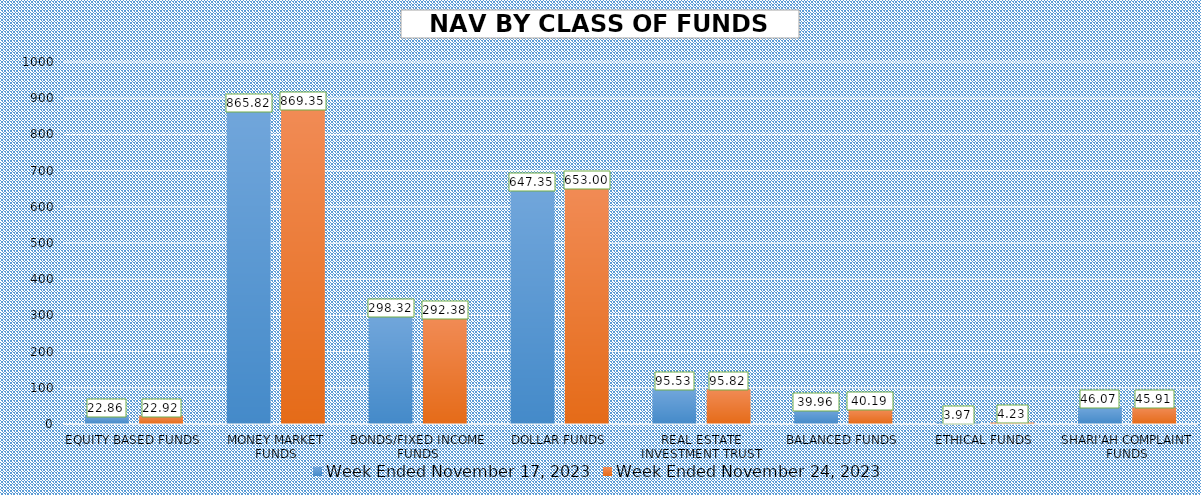
| Category | Week Ended November 17, 2023 | Week Ended November 24, 2023 |
|---|---|---|
| EQUITY BASED FUNDS | 22.859 | 22.918 |
| MONEY MARKET FUNDS | 865.823 | 869.351 |
| BONDS/FIXED INCOME FUNDS | 298.318 | 292.383 |
| DOLLAR FUNDS | 647.35 | 652.997 |
| REAL ESTATE INVESTMENT TRUST | 95.531 | 95.821 |
| BALANCED FUNDS | 39.961 | 40.186 |
| ETHICAL FUNDS | 3.973 | 4.234 |
| SHARI'AH COMPLAINT FUNDS | 46.065 | 45.908 |